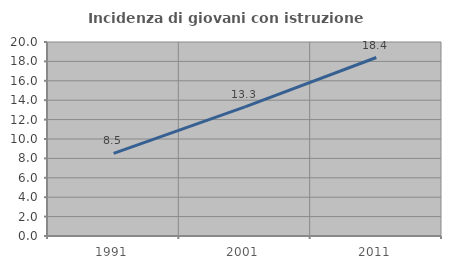
| Category | Incidenza di giovani con istruzione universitaria |
|---|---|
| 1991.0 | 8.519 |
| 2001.0 | 13.308 |
| 2011.0 | 18.402 |